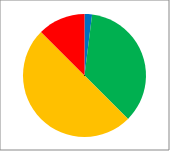
| Category | Count | % |
|---|---|---|
| Outstanding | 3 | 0.02 |
| Good | 54 | 0.355 |
| RI | 76 | 0.5 |
| Inadequate | 19 | 0.125 |